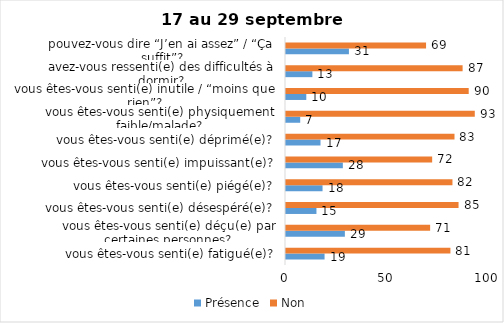
| Category | Présence | Non |
|---|---|---|
| vous êtes-vous senti(e) fatigué(e)? | 19 | 81 |
| vous êtes-vous senti(e) déçu(e) par certaines personnes? | 29 | 71 |
| vous êtes-vous senti(e) désespéré(e)? | 15 | 85 |
| vous êtes-vous senti(e) piégé(e)? | 18 | 82 |
| vous êtes-vous senti(e) impuissant(e)? | 28 | 72 |
| vous êtes-vous senti(e) déprimé(e)? | 17 | 83 |
| vous êtes-vous senti(e) physiquement faible/malade? | 7 | 93 |
| vous êtes-vous senti(e) inutile / “moins que rien”? | 10 | 90 |
| avez-vous ressenti(e) des difficultés à dormir? | 13 | 87 |
| pouvez-vous dire “J’en ai assez” / “Ça suffit”? | 31 | 69 |